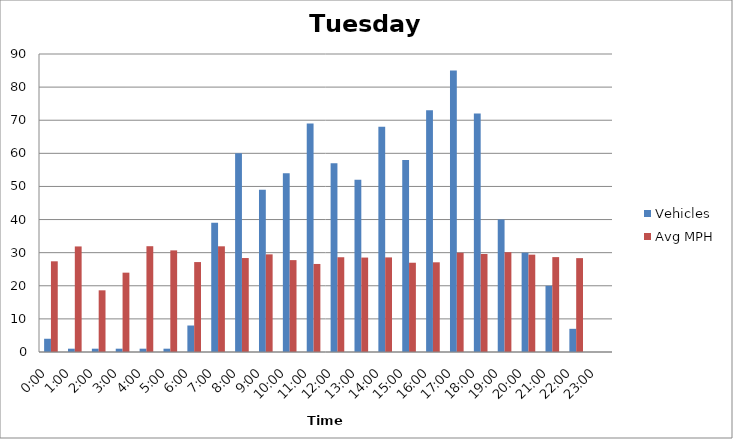
| Category | Vehicles | Avg MPH |
|---|---|---|
| 0:00 | 4 | 27.39 |
| 1:00 | 1 | 31.88 |
| 2:00 | 1 | 18.63 |
| 3:00 | 1 | 23.96 |
| 4:00 | 1 | 31.95 |
| 5:00 | 1 | 30.69 |
| 6:00 | 8 | 27.16 |
| 7:00 | 39 | 31.92 |
| 8:00 | 60 | 28.38 |
| 9:00 | 49 | 29.49 |
| 10:00 | 54 | 27.75 |
| 11:00 | 69 | 26.59 |
| 12:00 | 57 | 28.62 |
| 13:00 | 52 | 28.52 |
| 14:00 | 68 | 28.57 |
| 15:00 | 58 | 26.96 |
| 16:00 | 73 | 27.09 |
| 17:00 | 85 | 29.98 |
| 18:00 | 72 | 29.59 |
| 19:00 | 40 | 30.14 |
| 20:00 | 30 | 29.4 |
| 21:00 | 20 | 28.66 |
| 22:00 | 7 | 28.35 |
| 23:00 | 0 | 0 |